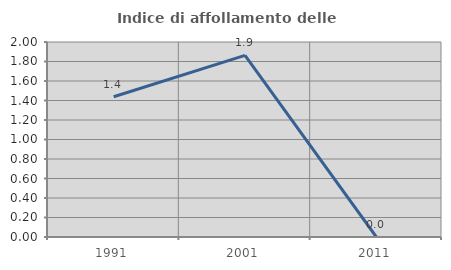
| Category | Indice di affollamento delle abitazioni  |
|---|---|
| 1991.0 | 1.439 |
| 2001.0 | 1.863 |
| 2011.0 | 0 |